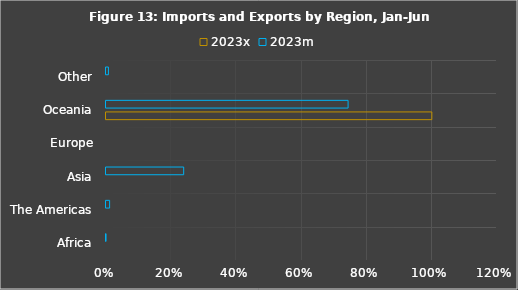
| Category | 2023x | 2023m |
|---|---|---|
| Africa | 0 | 0 |
| The Americas | 0 | 0.011 |
| Asia | 0 | 0.238 |
| Europe | 0 | 0 |
| Oceania | 1 | 0.743 |
| Other | 0 | 0.007 |